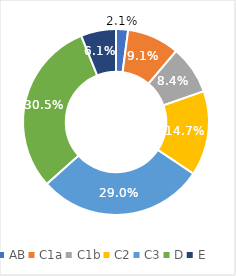
| Category | Series 0 |
|---|---|
| AB | 0.021 |
| C1a | 0.091 |
| C1b | 0.084 |
| C2 | 0.147 |
| C3 | 0.29 |
| D | 0.305 |
| E | 0.061 |